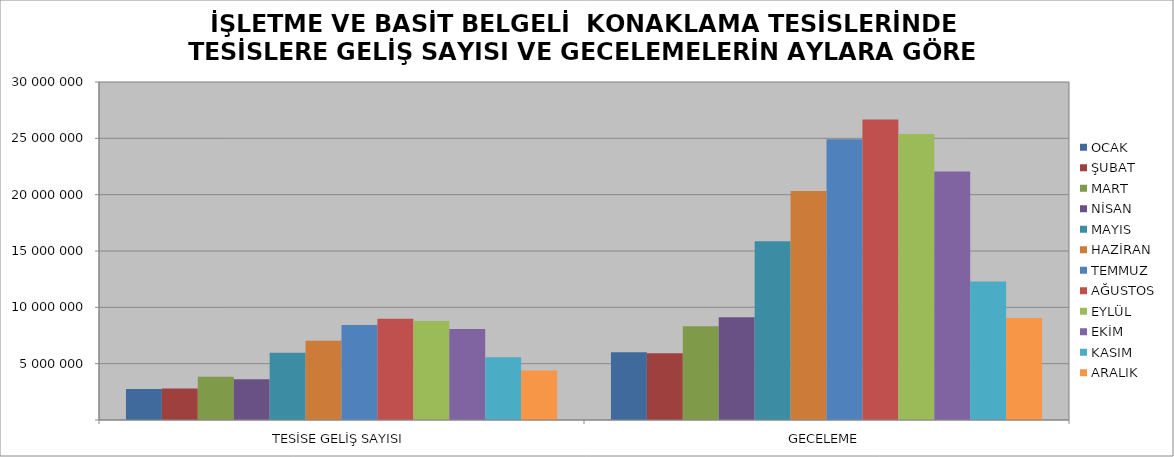
| Category | OCAK | ŞUBAT | MART | NİSAN | MAYIS | HAZİRAN | TEMMUZ | AĞUSTOS | EYLÜL | EKİM | KASIM | ARALIK |
|---|---|---|---|---|---|---|---|---|---|---|---|---|
| TESİSE GELİŞ SAYISI | 2752012 | 2800059 | 3828458 | 3612924 | 5975439 | 7040520 | 8433434 | 8994064 | 8797368 | 8067354 | 5562469 | 4403588 |
| GECELEME | 6020345 | 5929648 | 8312048 | 9130051 | 15857894 | 20320271 | 24913644 | 26662869 | 25388839 | 22061347 | 12301645 | 9051058 |